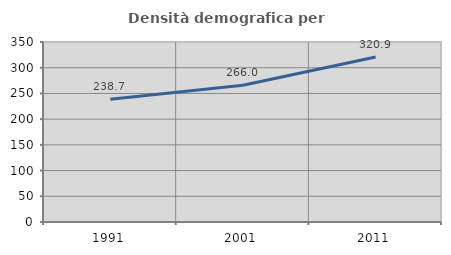
| Category | Densità demografica |
|---|---|
| 1991.0 | 238.745 |
| 2001.0 | 265.987 |
| 2011.0 | 320.882 |